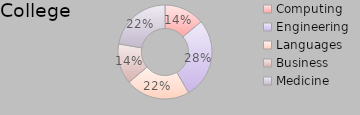
| Category | College |
|---|---|
| Computing | 5 |
| Engineering | 10 |
| Languages | 8 |
| Business | 5 |
| Medicine | 8 |